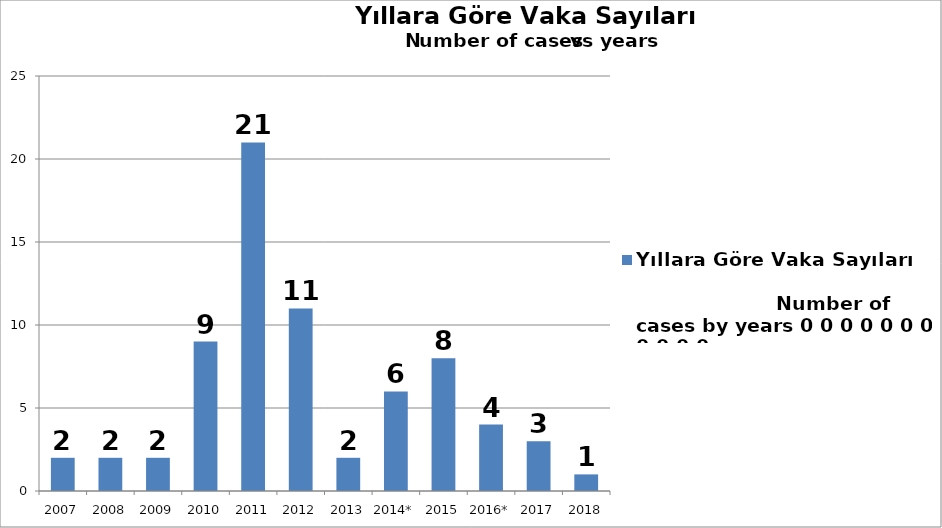
| Category | Yıllara Göre Vaka Sayıları                                                                        Number of cases by years 0 0 0 0 0 0 0 0 0 0 0 |
|---|---|
| 2007 | 2 |
| 2008 | 2 |
| 2009 | 2 |
| 2010 | 9 |
| 2011 | 21 |
| 2012 | 11 |
| 2013 | 2 |
| 2014* | 6 |
| 2015 | 8 |
| 2016* | 4 |
| 2017 | 3 |
| 2018 | 1 |